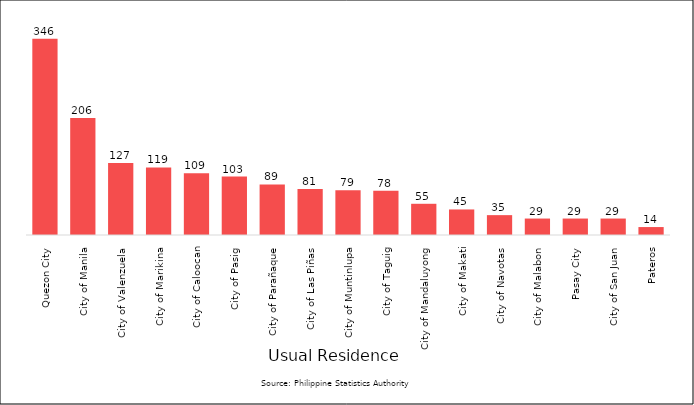
| Category | Series 0 |
|---|---|
|  Quezon City | 346 |
|  City of Manila | 206 |
|  City of Valenzuela | 127 |
|  City of Marikina | 119 |
|  City of Caloocan | 109 |
|  City of Pasig | 103 |
|  City of Parañaque | 89 |
|  City of Las Piñas | 81 |
|  City of Muntinlupa | 79 |
|  City of Taguig | 78 |
|  City of Mandaluyong | 55 |
|  City of Makati | 45 |
|  City of Navotas | 35 |
|  City of Malabon | 29 |
|  Pasay City | 29 |
|  City of San Juan | 29 |
|  Pateros | 14 |